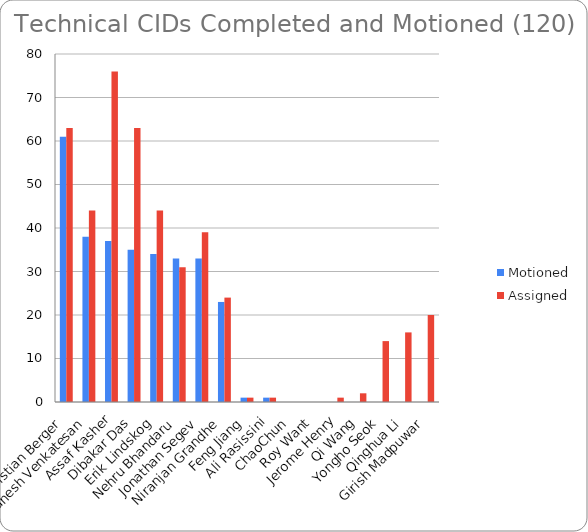
| Category | Motioned | Assigned |
|---|---|---|
| Christian Berger | 61 | 63 |
| Ganesh Venkatesan | 38 | 44 |
| Assaf Kasher | 37 | 76 |
| Dibakar Das | 35 | 63 |
| Erik Lindskog | 34 | 44 |
| Nehru Bhandaru | 33 | 31 |
| Jonathan Segev | 33 | 39 |
| Niranjan Grandhe | 23 | 24 |
| Feng Jiang | 1 | 1 |
| Ali Rasissini | 1 | 1 |
| ChaoChun | 0 | 0 |
| Roy Want | 0 | 0 |
| Jerome Henry | 0 | 1 |
| Qi Wang | 0 | 2 |
| Yongho Seok | 0 | 14 |
| Qinghua Li | 0 | 16 |
| Girish Madpuwar | 0 | 20 |